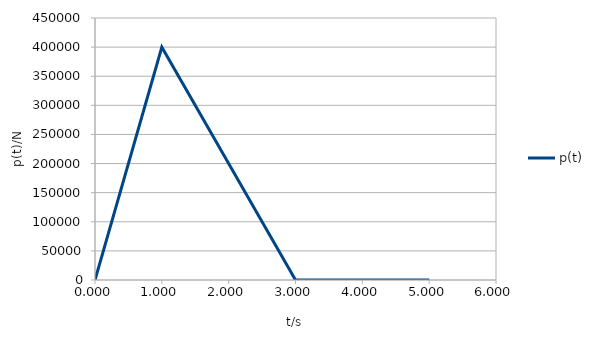
| Category | p(t) |
|---|---|
| 0.0 | 0 |
| 0.05 | 20000 |
| 0.1 | 40000 |
| 0.15 | 60000 |
| 0.2 | 80000 |
| 0.25 | 100000 |
| 0.3 | 120000 |
| 0.35 | 140000 |
| 0.4 | 160000 |
| 0.45 | 180000 |
| 0.5 | 200000 |
| 0.55 | 220000 |
| 0.6 | 240000 |
| 0.65 | 260000 |
| 0.7 | 280000 |
| 0.75 | 300000 |
| 0.8 | 320000 |
| 0.85 | 340000 |
| 0.9 | 360000 |
| 0.95 | 380000 |
| 1.0 | 400000 |
| 1.05 | 390000 |
| 1.1 | 380000 |
| 1.15 | 370000 |
| 1.2 | 360000 |
| 1.25 | 350000 |
| 1.3 | 340000 |
| 1.35 | 330000 |
| 1.4 | 320000 |
| 1.45 | 310000 |
| 1.5 | 300000 |
| 1.55 | 290000 |
| 1.6 | 280000 |
| 1.65 | 270000 |
| 1.7 | 260000 |
| 1.75 | 250000 |
| 1.8 | 240000 |
| 1.85 | 230000 |
| 1.9 | 220000 |
| 1.95 | 210000 |
| 2.0 | 200000 |
| 2.05 | 190000 |
| 2.1 | 180000 |
| 2.15 | 170000 |
| 2.2 | 160000 |
| 2.25 | 150000 |
| 2.3 | 140000 |
| 2.35 | 130000 |
| 2.4 | 120000 |
| 2.45 | 110000 |
| 2.5 | 100000 |
| 2.55 | 90000 |
| 2.6 | 80000 |
| 2.65 | 70000 |
| 2.7 | 60000 |
| 2.75 | 50000 |
| 2.8 | 40000 |
| 2.85 | 30000 |
| 2.9 | 20000 |
| 2.95 | 10000 |
| 3.0 | 0 |
| 3.05 | 0 |
| 3.1 | 0 |
| 3.15 | 0 |
| 3.2 | 0 |
| 3.25 | 0 |
| 3.3 | 0 |
| 3.35 | 0 |
| 3.4 | 0 |
| 3.45 | 0 |
| 3.5 | 0 |
| 3.55 | 0 |
| 3.6 | 0 |
| 3.64999999999999 | 0 |
| 3.69999999999999 | 0 |
| 3.74999999999999 | 0 |
| 3.79999999999999 | 0 |
| 3.84999999999999 | 0 |
| 3.89999999999999 | 0 |
| 3.94999999999999 | 0 |
| 3.99999999999999 | 0 |
| 4.04999999999999 | 0 |
| 4.09999999999999 | 0 |
| 4.14999999999999 | 0 |
| 4.19999999999999 | 0 |
| 4.24999999999999 | 0 |
| 4.29999999999999 | 0 |
| 4.34999999999999 | 0 |
| 4.39999999999999 | 0 |
| 4.44999999999999 | 0 |
| 4.49999999999999 | 0 |
| 4.54999999999999 | 0 |
| 4.59999999999999 | 0 |
| 4.64999999999999 | 0 |
| 4.69999999999999 | 0 |
| 4.74999999999999 | 0 |
| 4.79999999999999 | 0 |
| 4.84999999999999 | 0 |
| 4.89999999999999 | 0 |
| 4.94999999999999 | 0 |
| 4.99999999999999 | 0 |